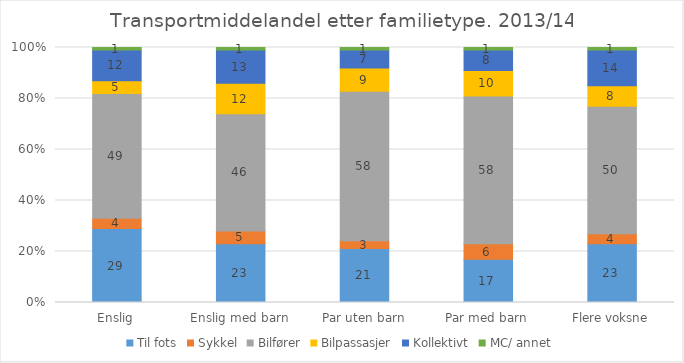
| Category | Til fots | Sykkel | Bilfører | Bilpassasjer | Kollektivt | MC/ annet |
|---|---|---|---|---|---|---|
| Enslig | 29 | 4 | 49 | 5 | 12 | 1 |
| Enslig med barn | 23 | 5 | 46 | 12 | 13 | 1 |
| Par uten barn | 21 | 3 | 58 | 9 | 7 | 1 |
| Par med barn | 17 | 6 | 58 | 10 | 8 | 1 |
| Flere voksne | 23 | 4 | 50 | 8 | 14 | 1 |